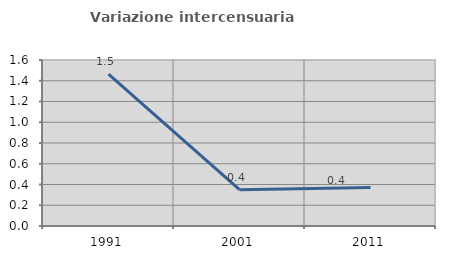
| Category | Variazione intercensuaria annua |
|---|---|
| 1991.0 | 1.464 |
| 2001.0 | 0.35 |
| 2011.0 | 0.372 |